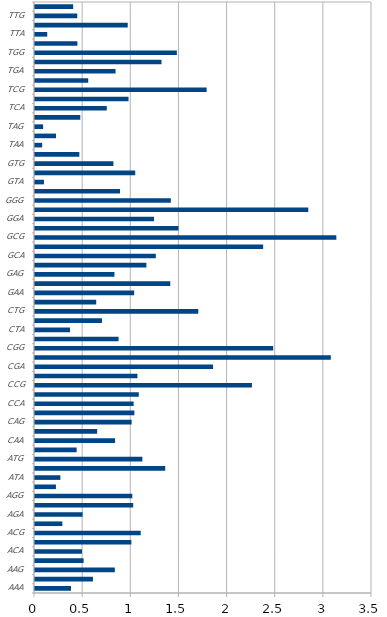
| Category | Series 0 |
|---|---|
| AAA | 0.374 |
| AAC | 0.602 |
| AAG | 0.829 |
| AAT | 0.505 |
| ACA | 0.488 |
| ACC | 1.001 |
| ACG | 1.098 |
| ACT | 0.284 |
| AGA | 0.495 |
| AGC | 1.02 |
| AGG | 1.01 |
| AGT | 0.217 |
| ATA | 0.264 |
| ATC | 1.353 |
| ATG | 1.115 |
| ATT | 0.433 |
| CAA | 0.832 |
| CAC | 0.645 |
| CAG | 1.004 |
| CAT | 1.032 |
| CCA | 1.024 |
| CCC | 1.078 |
| CCG | 2.253 |
| CCT | 1.064 |
| CGA | 1.849 |
| CGC | 3.072 |
| CGG | 2.474 |
| CGT | 0.868 |
| CTA | 0.363 |
| CTC | 0.695 |
| CTG | 1.696 |
| CTT | 0.636 |
| GAA | 1.03 |
| GAC | 1.405 |
| GAG | 0.825 |
| GAT | 1.157 |
| GCA | 1.255 |
| GCC | 2.369 |
| GCG | 3.13 |
| GCT | 1.49 |
| GGA | 1.236 |
| GGC | 2.838 |
| GGG | 1.411 |
| GGT | 0.883 |
| GTA | 0.093 |
| GTC | 1.041 |
| GTG | 0.814 |
| GTT | 0.461 |
| TAA | 0.074 |
| TAC | 0.218 |
| TAG | 0.084 |
| TAT | 0.47 |
| TCA | 0.745 |
| TCC | 0.971 |
| TCG | 1.783 |
| TCT | 0.553 |
| TGA | 0.837 |
| TGC | 1.314 |
| TGG | 1.473 |
| TGT | 0.44 |
| TTA | 0.127 |
| TTC | 0.963 |
| TTG | 0.439 |
| TTT | 0.396 |